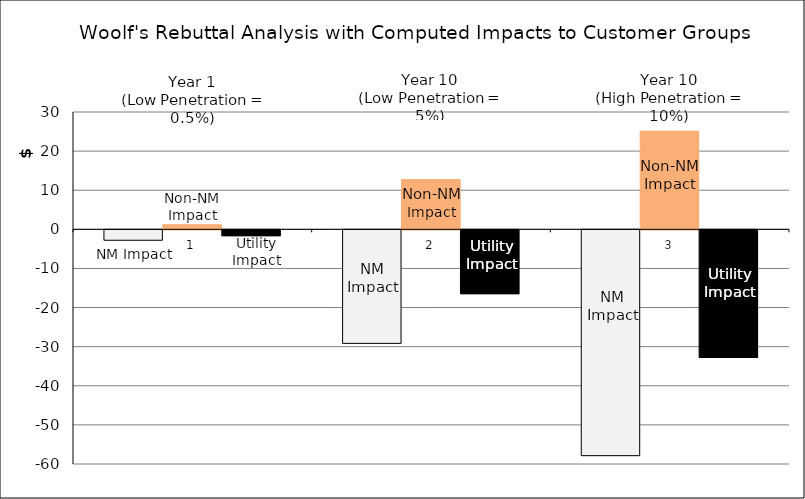
| Category | Series 0 | Series 1 | Series 2 |
|---|---|---|---|
| 0 | -2666793.777 | 1175030.133 | -1491763.644 |
| 1 | -29031795.847 | 12716596.57 | -16315199.277 |
| 2 | -57740680.284 | 25110281.729 | -32630398.555 |